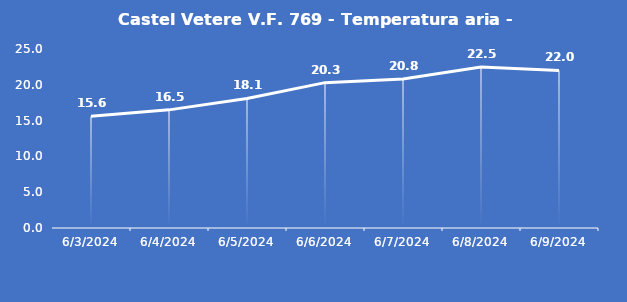
| Category | Castel Vetere V.F. 769 - Temperatura aria - Grezzo (°C) |
|---|---|
| 6/3/24 | 15.6 |
| 6/4/24 | 16.5 |
| 6/5/24 | 18.1 |
| 6/6/24 | 20.3 |
| 6/7/24 | 20.8 |
| 6/8/24 | 22.5 |
| 6/9/24 | 22 |